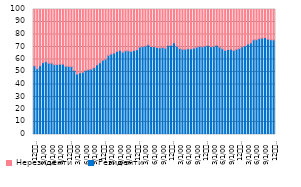
| Category | Резиденти | Нерезиденти |
|---|---|---|
| 12
2013. | 54.939 | 45.061 |
| 1 | 52.632 | 47.368 |
| 2 | 55.024 | 44.976 |
| 3 | 57.529 | 42.471 |
| 4 | 58.275 | 41.725 |
| 5 | 56.994 | 43.006 |
| 6 | 57.079 | 42.921 |
| 7 | 55.908 | 44.092 |
| 8 | 55.99 | 44.01 |
| 9 | 56.259 | 43.741 |
| 10 | 56.316 | 43.684 |
| 11 | 54.626 | 45.374 |
| 12
2014. | 54.518 | 45.482 |
| 1 | 54.275 | 45.725 |
| 2 | 51.149 | 48.851 |
| 3 | 48.387 | 51.613 |
| 4 | 49.394 | 50.606 |
| 5 | 49.863 | 50.137 |
| 6 | 51.173 | 48.827 |
| 7 | 51.916 | 48.084 |
| 8 | 52.313 | 47.687 |
| 9 | 53.486 | 46.514 |
| 10 | 55.78 | 44.22 |
| 11 | 57.361 | 42.639 |
| 12
2015. | 59.38 | 40.62 |
| 1 | 60.252 | 39.748 |
| 2 | 63.321 | 36.679 |
| 3 | 64.419 | 35.581 |
| 4 | 65.102 | 34.898 |
| 5 | 66.515 | 33.485 |
| 6 | 67.33 | 32.67 |
| 7 | 65.846 | 34.154 |
| 8 | 66.966 | 33.034 |
| 9 | 66.935 | 33.065 |
| 10 | 66.482 | 33.518 |
| 11 | 67.293 | 32.707 |
| 12
2016. | 67.823 | 32.177 |
| 1 | 69.888 | 30.112 |
| 2 | 70.36 | 29.64 |
| 3 | 70.739 | 29.261 |
| 4 | 71.751 | 28.249 |
| 5 | 70.41 | 29.59 |
| 6 | 70.279 | 29.721 |
| 7 | 69.666 | 30.334 |
| 8 | 69.318 | 30.682 |
| 9 | 69.544 | 30.456 |
| 10 | 68.976 | 31.024 |
| 11 | 71.255 | 28.745 |
| 12
2017. | 71.404 | 28.596 |
| 1 | 73.407 | 26.593 |
| 2 | 70.601 | 29.399 |
| 3 | 68.779 | 31.221 |
| 4 | 68.22 | 31.78 |
| 5 | 68.185 | 31.815 |
| 6 | 68.639 | 31.361 |
| 7 | 68.533 | 31.467 |
| 8 | 69.133 | 30.867 |
| 9 | 69.84 | 30.16 |
| 10 | 70.47 | 29.53 |
| 11 | 70.173 | 29.827 |
| 12
2018. | 70.775 | 29.225 |
| 1 | 71.357 | 28.643 |
| 2 | 70.234 | 29.766 |
| 3 | 70.548 | 29.452 |
| 4 | 71.349 | 28.651 |
| 5 | 69.929 | 30.071 |
| 6 | 68.659 | 31.341 |
| 7 | 67.282 | 32.718 |
| 8 | 68.026 | 31.974 |
| 9 | 68.252 | 31.748 |
| 10 | 67.245 | 32.755 |
| 11 | 68.232 | 31.768 |
| 12
2019. | 68.829 | 31.171 |
| 1 | 70.218 | 29.782 |
| 2 | 71.009 | 28.991 |
| 3 | 72.419 | 27.581 |
| 4 | 73.241 | 26.759 |
| 5 | 75.701 | 24.299 |
| 6 | 75.824 | 24.176 |
| 7 | 76.71 | 23.29 |
| 8 | 77.105 | 22.895 |
| 9 | 77.53 | 22.47 |
| 10 | 76.286 | 23.714 |
| 11 | 75.796 | 24.204 |
| 12
2020. | 75.693 | 24.307 |